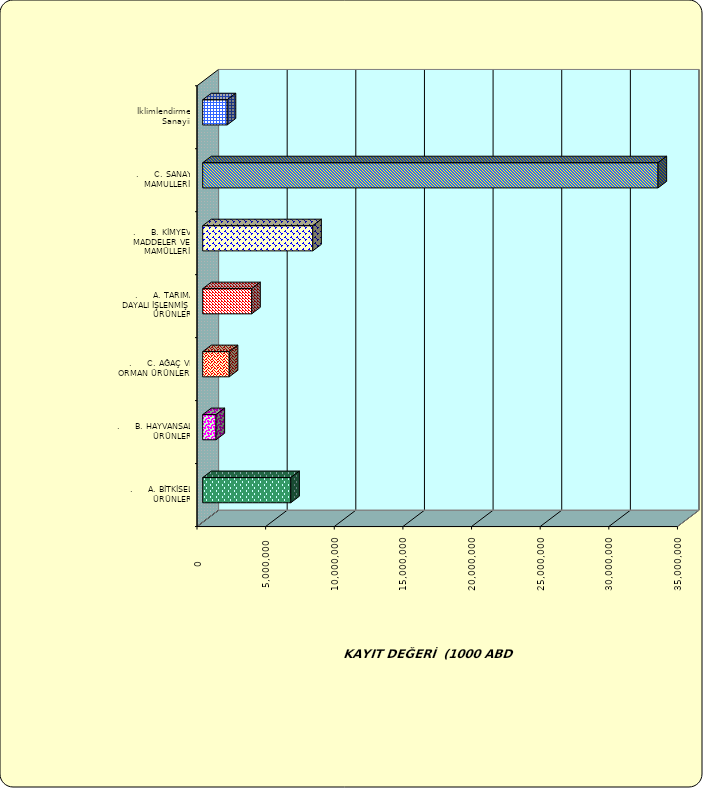
| Category | Series 0 |
|---|---|
| .     A. BİTKİSEL ÜRÜNLER | 6415876.71 |
| .     B. HAYVANSAL ÜRÜNLER | 970853.891 |
| .     C. AĞAÇ VE ORMAN ÜRÜNLERİ | 1933975.338 |
| .     A. TARIMA DAYALI İŞLENMİŞ ÜRÜNLER | 3570686.868 |
| .     B. KİMYEVİ MADDELER VE MAMÜLLERİ | 8019100.008 |
| .     C. SANAYİ MAMULLERİ | 33169961.935 |
|  İklimlendirme Sanayii | 1783420.316 |